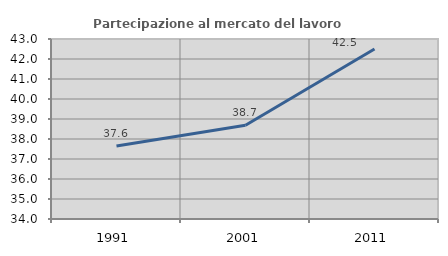
| Category | Partecipazione al mercato del lavoro  femminile |
|---|---|
| 1991.0 | 37.649 |
| 2001.0 | 38.684 |
| 2011.0 | 42.5 |